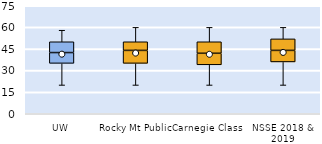
| Category | 25th | 50th | 75th |
|---|---|---|---|
| UW | 35 | 7.5 | 7.5 |
| Rocky Mt Public | 35 | 9 | 6 |
| Carnegie Class | 34 | 8 | 8 |
| NSSE 2018 & 2019 | 36 | 8 | 8 |